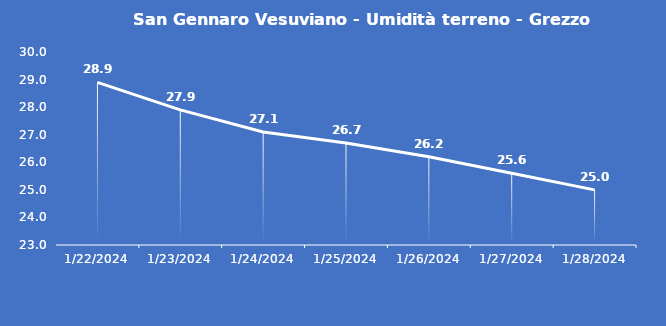
| Category | San Gennaro Vesuviano - Umidità terreno - Grezzo (%VWC) |
|---|---|
| 1/22/24 | 28.9 |
| 1/23/24 | 27.9 |
| 1/24/24 | 27.1 |
| 1/25/24 | 26.7 |
| 1/26/24 | 26.2 |
| 1/27/24 | 25.6 |
| 1/28/24 | 25 |